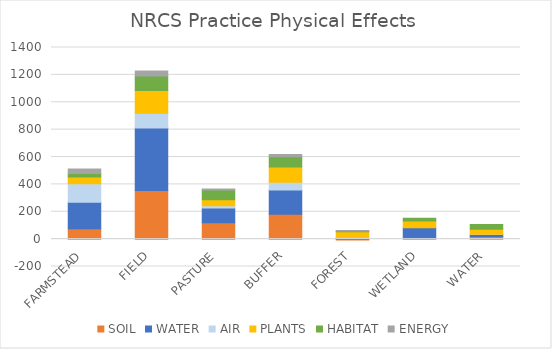
| Category | SOIL | WATER | AIR | PLANTS | HABITAT | ENERGY |
|---|---|---|---|---|---|---|
| FARMSTEAD | 75 | 194 | 136 | 48 | 26 | 33 |
| FIELD | 355 | 457 | 107 | 166 | 107 | 36 |
| PASTURE | 120 | 107 | 16 | 45 | 71 | 7 |
| BUFFER | 182 | 177 | 57 | 111 | 74 | 18 |
| FOREST | -6 | 7 | 7 | 40 | 6 | 3 |
| WETLAND | 4 | 79 | 0 | 50 | 19 | 0 |
| WATER | 17 | 17 | 1 | 37 | 34 | 0 |